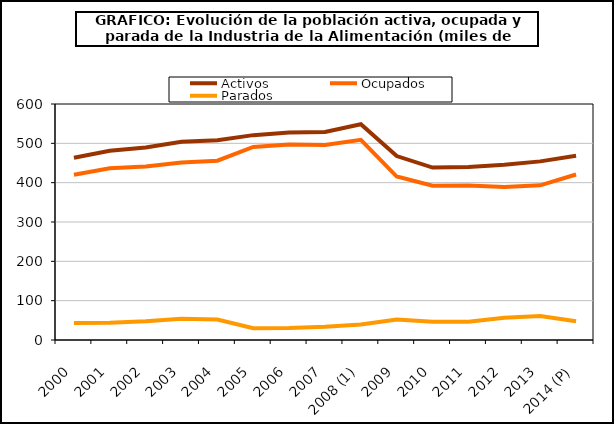
| Category | Activos | Ocupados | Parados |
|---|---|---|---|
| 2000 | 463.425 | 420.2 | 43.475 |
| 2001 | 480.9 | 436.8 | 43.725 |
| 2002 | 489.575 | 441 | 47.8 |
| 2003 | 504 | 451.5 | 54 |
| 2004 | 508.05 | 455.9 | 52.175 |
| 2005 | 520.85 | 490.7 | 30.15 |
| 2006 | 527.375 | 496.9 | 30.475 |
| 2007 | 529 | 495.6 | 33.4 |
| 2008 (1) | 548.65 | 509 | 39.7 |
| 2009 | 467.6 | 415.6 | 52 |
| 2010 | 438.425 | 392.275 | 46.2 |
| 2011 | 439.6 | 393.1 | 46.5 |
| 2012 | 445.725 | 388.925 | 56.8 |
| 2013 | 454.1 | 393.3 | 60.8 |
| 2014 (P) | 468.5 | 420.7 | 47.8 |